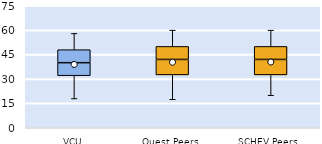
| Category | 25th | 50th | 75th |
|---|---|---|---|
| VCU | 32 | 8 | 8 |
| Quest Peers | 32.5 | 9.5 | 8 |
| SCHEV Peers | 32.5 | 9.5 | 8 |